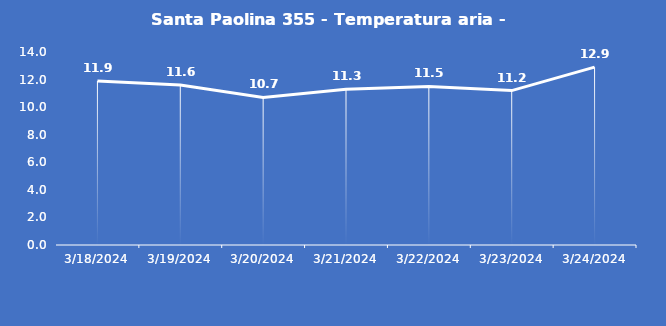
| Category | Santa Paolina 355 - Temperatura aria - Grezzo (°C) |
|---|---|
| 3/18/24 | 11.9 |
| 3/19/24 | 11.6 |
| 3/20/24 | 10.7 |
| 3/21/24 | 11.3 |
| 3/22/24 | 11.5 |
| 3/23/24 | 11.2 |
| 3/24/24 | 12.9 |